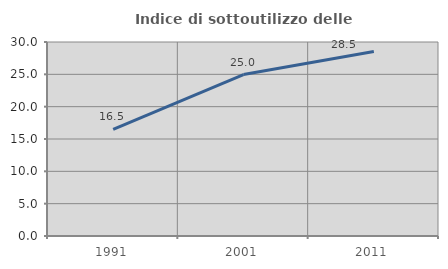
| Category | Indice di sottoutilizzo delle abitazioni  |
|---|---|
| 1991.0 | 16.506 |
| 2001.0 | 24.97 |
| 2011.0 | 28.539 |